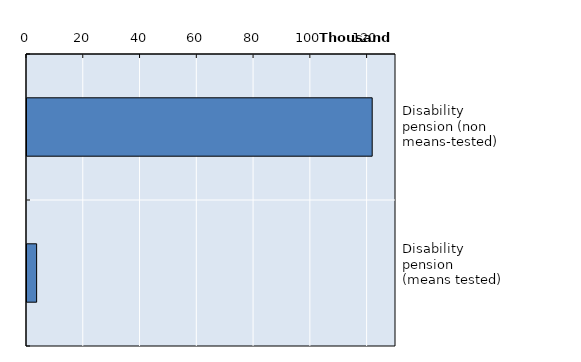
| Category | Series 0 |
|---|---|
| Disability pension (non means-tested) | 121612 |
| Disability pension (means tested) | 3393 |